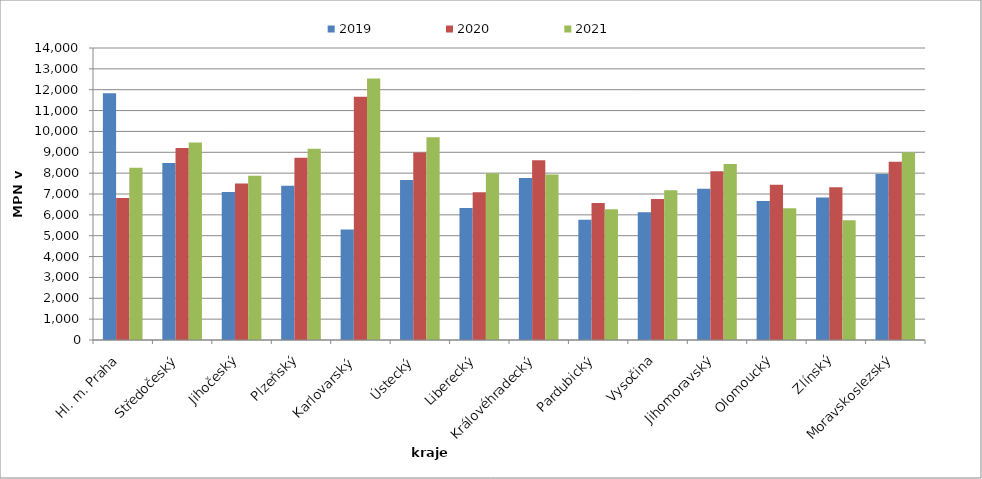
| Category | 2019 | 2020 | 2021 |
|---|---|---|---|
| Hl. m. Praha | 11826 | 6809 | 8259 |
| Středočeský | 8484 | 9210 | 9475 |
| Jihočeský | 7091 | 7506 | 7873 |
| Plzeňský | 7395 | 8735 | 9172 |
| Karlovarský  | 5298 | 11658 | 12535 |
| Ústecký   | 7666 | 8987 | 9723 |
| Liberecký | 6331 | 7078 | 7995 |
| Královéhradecký | 7763 | 8617 | 7932 |
| Pardubický | 5763 | 6569 | 6271 |
| Vysočina | 6130 | 6764 | 7178 |
| Jihomoravský | 7252 | 8087 | 8438 |
| Olomoucký | 6660 | 7447 | 6317 |
| Zlínský | 6828 | 7326 | 5736 |
| Moravskoslezský | 7963 | 8546 | 9003 |